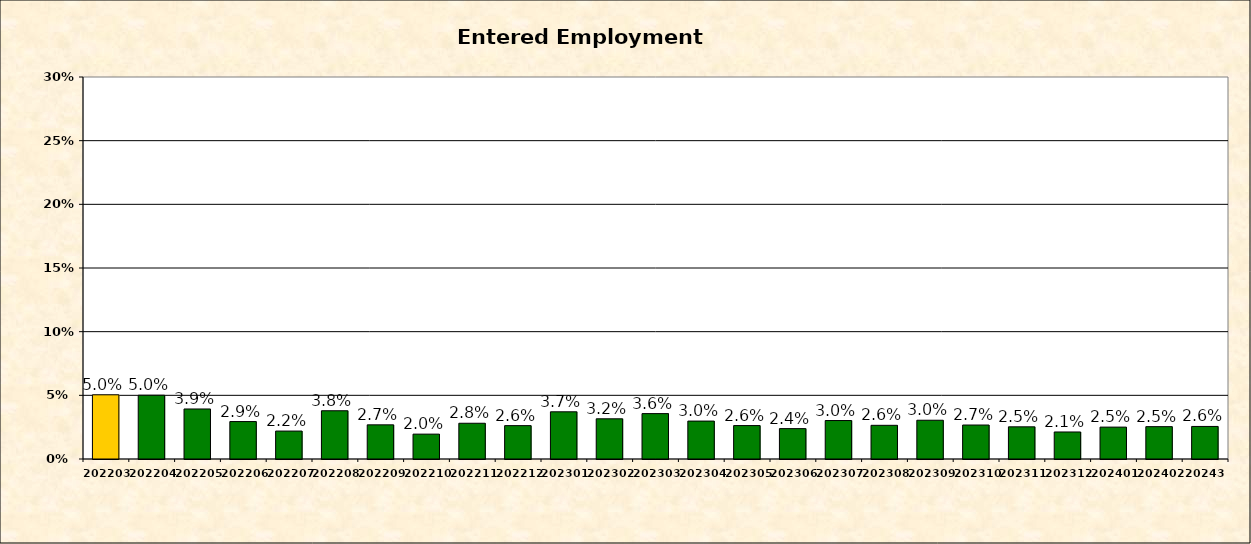
| Category | 202203 |
|---|---|
| 202203.0 | 0.05 |
| 202204.0 | 0.05 |
| 202205.0 | 0.039 |
| 202206.0 | 0.029 |
| 202207.0 | 0.022 |
| 202208.0 | 0.038 |
| 202209.0 | 0.027 |
| 202210.0 | 0.02 |
| 202211.0 | 0.028 |
| 202212.0 | 0.026 |
| 202301.0 | 0.037 |
| 202302.0 | 0.032 |
| 202303.0 | 0.036 |
| 202304.0 | 0.03 |
| 202305.0 | 0.026 |
| 202306.0 | 0.024 |
| 202307.0 | 0.03 |
| 202308.0 | 0.026 |
| 202309.0 | 0.03 |
| 202310.0 | 0.027 |
| 202311.0 | 0.025 |
| 202312.0 | 0.021 |
| 202401.0 | 0.025 |
| 202402.0 | 0.025 |
| 20243.0 | 0.026 |